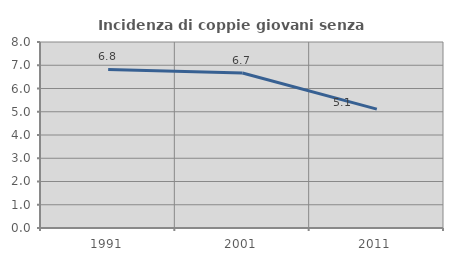
| Category | Incidenza di coppie giovani senza figli |
|---|---|
| 1991.0 | 6.818 |
| 2001.0 | 6.667 |
| 2011.0 | 5.114 |